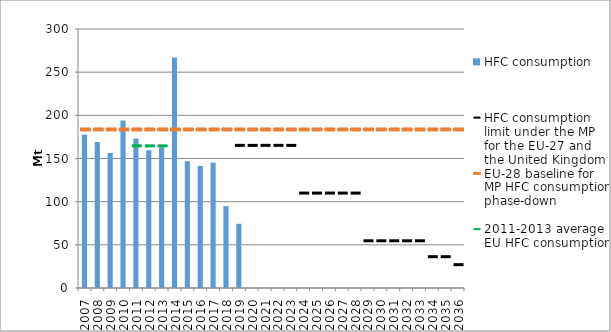
| Category | HFC consumption |
|---|---|
| 2007.0 | 177.516 |
| 2008.0 | 169.254 |
| 2009.0 | 156.355 |
| 2010.0 | 194.002 |
| 2011.0 | 173.175 |
| 2012.0 | 159.418 |
| 2013.0 | 163.159 |
| 2014.0 | 267.023 |
| 2015.0 | 146.947 |
| 2016.0 | 141.373 |
| 2017.0 | 145.148 |
| 2018.0 | 94.812 |
| 2019.0 | 74.393 |
| 2020.0 | 0 |
| 2021.0 | 0 |
| 2022.0 | 0 |
| 2023.0 | 0 |
| 2024.0 | 0 |
| 2025.0 | 0 |
| 2026.0 | 0 |
| 2027.0 | 0 |
| 2028.0 | 0 |
| 2029.0 | 0 |
| 2030.0 | 0 |
| 2031.0 | 0 |
| 2032.0 | 0 |
| 2033.0 | 0 |
| 2034.0 | 0 |
| 2035.0 | 0 |
| 2036.0 | 0 |